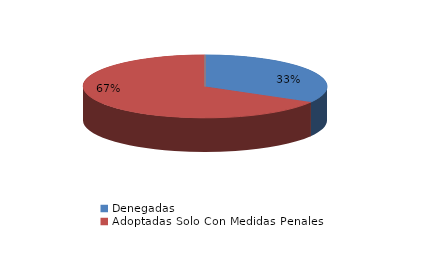
| Category | Series 0 |
|---|---|
| Denegadas | 2 |
| Adoptadas Solo Con Medidas Penales | 4 |
| Adoptadas Con Medidas Civiles Y Penales | 0 |
| Adoptadas Con Medidas Solo Civiles | 0 |